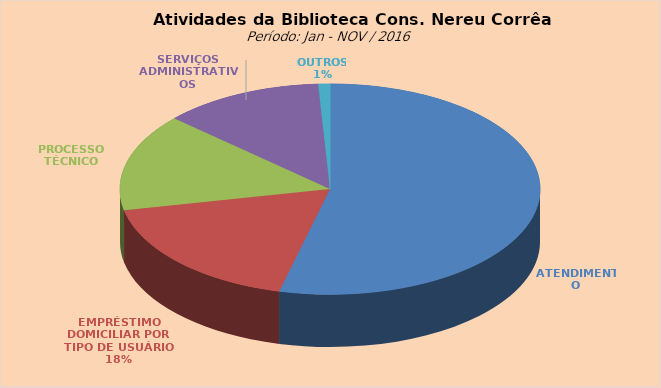
| Category | Series 0 |
|---|---|
| ATENDIMENTO | 17147 |
| EMPRÉSTIMO DOMICILIAR POR TIPO DE USUÁRIO | 5693 |
| PROCESSO TÉCNICO | 4768 |
| SERVIÇOS ADMINISTRATIVOS | 3931 |
| OUTROS | 287 |